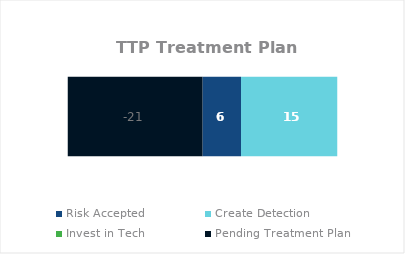
| Category | Risk Accepted  | Create Detection | Invest in Tech | Pending Treatment Plan |
|---|---|---|---|---|
| 0 | 6 | 15 | 0 | -21 |